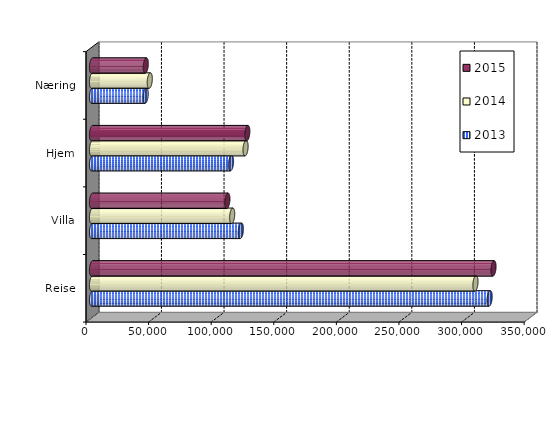
| Category | 2013 | 2014 | 2015 |
|---|---|---|---|
| Reise | 317630 | 306308 | 320739 |
| Villa | 118928 | 111974 | 108145.685 |
| Hjem | 111027 | 122672 | 124066.909 |
| Næring | 42880 | 46146 | 42956.936 |